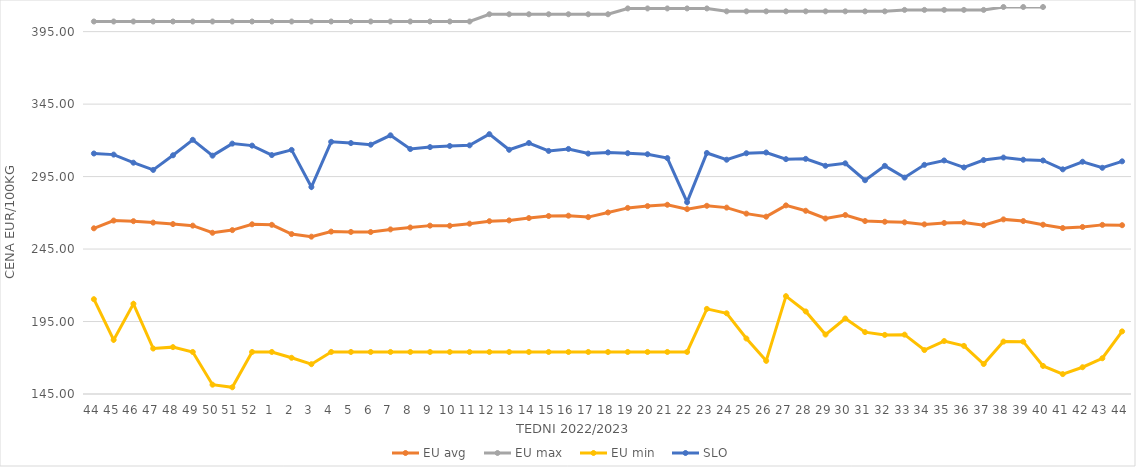
| Category | EU avg | EU max | EU min | SLO |
|---|---|---|---|---|
| 44.0 | 259.32 | 402 | 210.415 | 310.93 |
| 45.0 | 264.649 | 402 | 182.35 | 310.16 |
| 46.0 | 264.228 | 402 | 207.247 | 304.58 |
| 47.0 | 263.24 | 402 | 176.378 | 299.59 |
| 48.0 | 262.225 | 402 | 177.332 | 309.69 |
| 49.0 | 261.152 | 402 | 174 | 320.38 |
| 50.0 | 256.24 | 402 | 151.434 | 309.44 |
| 51.0 | 258.071 | 402 | 149.638 | 317.74 |
| 52.0 | 262.088 | 402 | 174 | 316.36 |
| 1.0 | 261.716 | 402 | 174 | 309.84 |
| 2.0 | 255.331 | 402 | 169.983 | 313.4 |
| 3.0 | 253.546 | 402 | 165.574 | 287.81 |
| 4.0 | 257.051 | 402 | 174 | 318.98 |
| 5.0 | 256.808 | 402 | 174 | 318.13 |
| 6.0 | 256.75 | 402 | 174 | 316.99 |
| 7.0 | 258.565 | 402 | 174 | 323.47 |
| 8.0 | 259.872 | 402 | 174 | 314 |
| 9.0 | 261.164 | 402 | 174 | 315.35 |
| 10.0 | 261.06 | 402 | 174 | 316.13 |
| 11.0 | 262.513 | 402 | 174 | 316.55 |
| 12.0 | 264.228 | 407 | 174 | 324.27 |
| 13.0 | 264.768 | 407 | 174 | 313.49 |
| 14.0 | 266.385 | 407 | 174 | 318.17 |
| 15.0 | 267.797 | 407 | 174 | 312.7 |
| 16.0 | 268.021 | 407 | 174 | 314.07 |
| 17.0 | 267.041 | 407 | 174 | 310.87 |
| 18.0 | 270.255 | 407 | 174 | 311.69 |
| 19.0 | 273.406 | 411 | 174 | 311.13 |
| 20.0 | 274.631 | 411 | 174 | 310.42 |
| 21.0 | 275.561 | 411 | 174 | 307.76 |
| 22.0 | 272.542 | 411 | 174 | 277.34 |
| 23.0 | 274.85 | 411 | 203.728 | 311.28 |
| 24.0 | 273.59 | 409 | 200.686 | 306.64 |
| 25.0 | 269.439 | 409 | 183.275 | 311.1 |
| 26.0 | 267.345 | 409 | 167.858 | 311.62 |
| 27.0 | 275.123 | 409 | 212.506 | 307.04 |
| 28.0 | 271.42 | 409 | 201.945 | 307.23 |
| 29.0 | 266.08 | 409 | 186.018 | 302.45 |
| 30.0 | 268.49 | 409 | 197.093 | 304.14 |
| 31.0 | 264.334 | 409 | 187.684 | 292.49 |
| 32.0 | 263.844 | 409 | 185.774 | 302.41 |
| 33.0 | 263.441 | 410 | 185.951 | 294.3 |
| 34.0 | 262.028 | 410 | 175.332 | 303.1 |
| 35.0 | 262.997 | 410 | 181.543 | 306.13 |
| 36.0 | 263.389 | 410 | 178.207 | 301.32 |
| 37.0 | 261.486 | 410 | 165.697 | 306.4 |
| 38.0 | 265.47 | 412 | 181.159 | 308.12 |
| 39.0 | 264.316 | 412 | 181.124 | 306.62 |
| 40.0 | 261.789 | 412 | 164.37 | 306.1 |
| 41.0 | 259.491 | 419 | 158.728 | 300 |
| 42.0 | 260.236 | 419 | 163.464 | 305.24 |
| 43.0 | 261.681 | 419 | 169.66 | 301.07 |
| 44.0 | 261.458 | 419 | 188.189 | 305.52 |